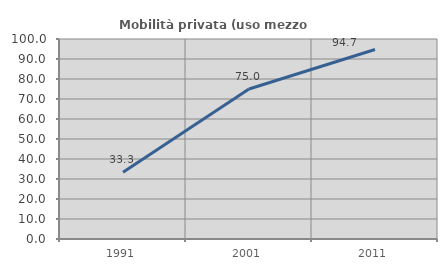
| Category | Mobilità privata (uso mezzo privato) |
|---|---|
| 1991.0 | 33.333 |
| 2001.0 | 75 |
| 2011.0 | 94.737 |